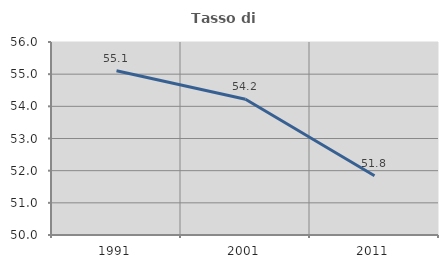
| Category | Tasso di occupazione   |
|---|---|
| 1991.0 | 55.107 |
| 2001.0 | 54.221 |
| 2011.0 | 51.843 |